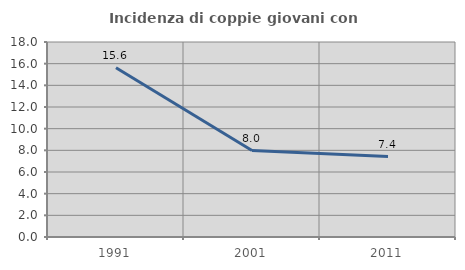
| Category | Incidenza di coppie giovani con figli |
|---|---|
| 1991.0 | 15.616 |
| 2001.0 | 7.979 |
| 2011.0 | 7.427 |